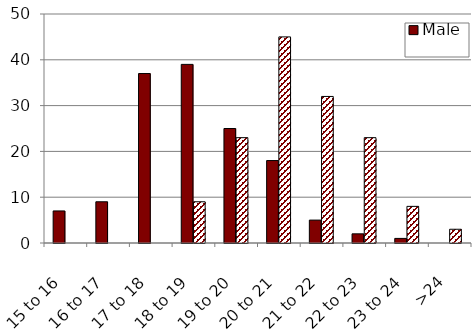
| Category | Male | Female |
|---|---|---|
| 15 to 16 | 7 | 0 |
| 16 to 17 | 9 | 0 |
| 17 to 18 | 37 | 0 |
| 18 to 19 | 39 | 9 |
| 19 to 20 | 25 | 23 |
| 20 to 21 | 18 | 45 |
| 21 to 22 | 5 | 32 |
| 22 to 23 | 2 | 23 |
| 23 to 24 | 1 | 8 |
| >24 | 0 | 3 |